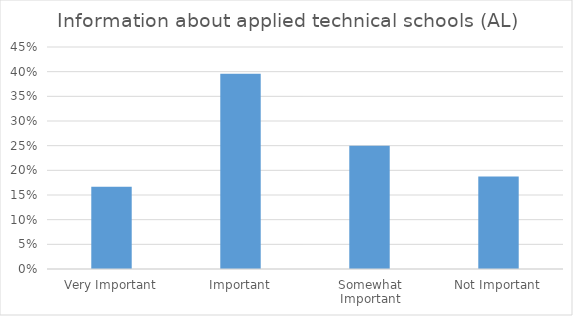
| Category | Information about applied technical schools (AL) |
|---|---|
| Very Important | 0.167 |
| Important | 0.396 |
| Somewhat Important | 0.25 |
| Not Important | 0.188 |